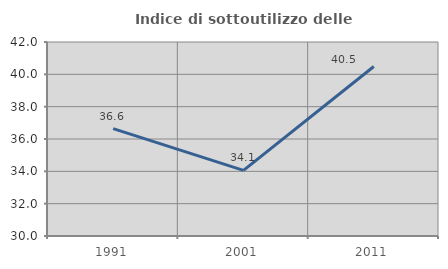
| Category | Indice di sottoutilizzo delle abitazioni  |
|---|---|
| 1991.0 | 36.643 |
| 2001.0 | 34.056 |
| 2011.0 | 40.482 |